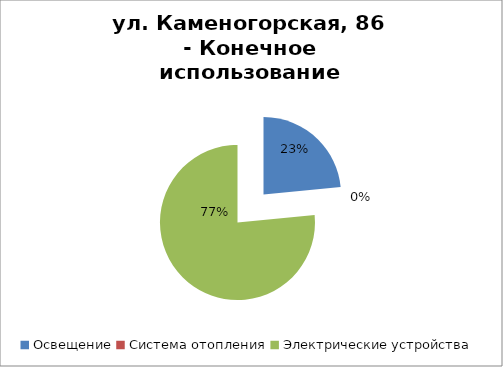
| Category | Series 0 |
|---|---|
| Освещение | 652.205 |
| Система отопления | 0 |
| Электрические устройства | 2129.521 |